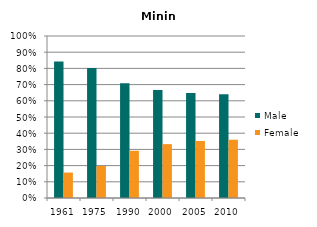
| Category | Male | Female |
|---|---|---|
| 1961.0 | 0.843 | 0.157 |
| 1975.0 | 0.802 | 0.198 |
| 1990.0 | 0.708 | 0.292 |
| 2000.0 | 0.667 | 0.333 |
| 2005.0 | 0.648 | 0.352 |
| 2010.0 | 0.64 | 0.36 |